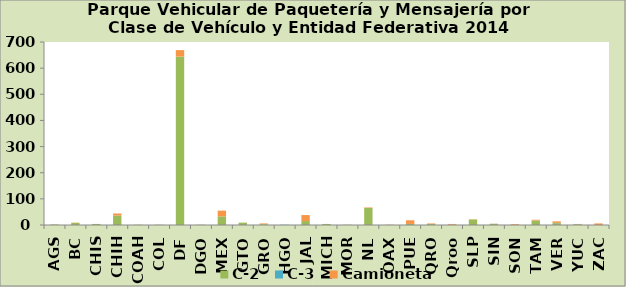
| Category | C-2 | C-3 | Camioneta |
|---|---|---|---|
| AGS | 2 | 0 | 0 |
| BC | 8 | 0 | 1 |
| CHIS | 4 | 0 | 0 |
| CHIH | 36 | 0 | 8 |
| COAH | 1 | 0 | 0 |
| COL | 1 | 0 | 0 |
| DF | 644 | 0 | 25 |
| DGO | 1 | 0 | 0 |
| MEX | 33 | 0 | 22 |
| GTO | 9 | 0 | 0 |
| GRO | 3 | 0 | 3 |
| HGO | 0 | 1 | 0 |
| JAL | 15 | 0 | 23 |
| MICH | 4 | 0 | 0 |
| MOR | 1 | 0 | 0 |
| NL | 65 | 0 | 2 |
| OAX | 0 | 0 | 1 |
| PUE | 4 | 0 | 14 |
| QRO | 4 | 0 | 2 |
| Qroo | 1 | 0 | 3 |
| SLP | 21 | 0 | 1 |
| SIN | 5 | 0 | 0 |
| SON | 0 | 0 | 3 |
| TAM | 17 | 0 | 3 |
| VER | 7 | 1 | 6 |
| YUC | 3 | 0 | 1 |
| ZAC | 0 | 0 | 6 |